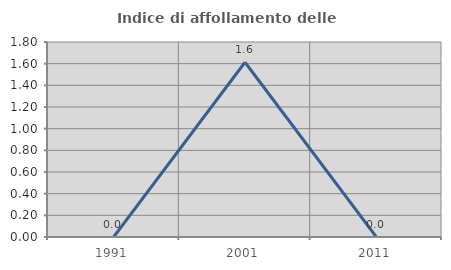
| Category | Indice di affollamento delle abitazioni  |
|---|---|
| 1991.0 | 0 |
| 2001.0 | 1.613 |
| 2011.0 | 0 |